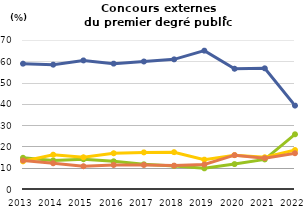
| Category | Étudiants | Enseignants et personnels d'éducation et de surveillance                            | Autres emplois dans secteurs public ou privé                | Sans emploi                    |
|---|---|---|---|---|
| 2013.0 | 58.879 | 14.658 | 12.998 | 13.4 |
| 2014.0 | 58.408 | 13.385 | 16.112 | 12.096 |
| 2015.0 | 60.4 | 14 | 14.9 | 10.7 |
| 2016.0 | 58.9 | 13 | 16.8 | 11.3 |
| 2017.0 | 59.9 | 11.6 | 17.2 | 11.3 |
| 2018.0 | 60.9 | 10.8 | 17.3 | 11 |
| 2019.0 | 65 | 9.7 | 13.8 | 11.5 |
| 2020.0 | 56.5 | 11.7 | 15.9 | 15.9 |
| 2021.0 | 56.7 | 13.9 | 14.9 | 14.5 |
| 2022.0 | 39.2 | 25.7 | 18.3 | 16.8 |